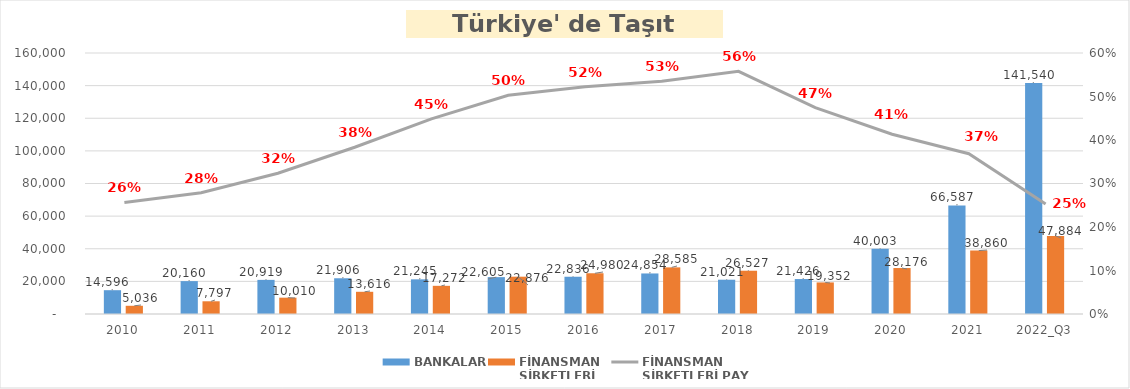
| Category | BANKALAR | FİNANSMAN 
ŞİRKETLERİ |
|---|---|---|
| 2010 | 14595.746 | 5035.89 |
| 2011 | 20160.143 | 7796.854 |
| 2012 | 20919.143 | 10009.755 |
| 2013 | 21905.99 | 13616.036 |
| 2014 | 21244.953 | 17271.844 |
| 2015 | 22605.033 | 22875.563 |
| 2016 | 22835.961 | 24980.231 |
| 2017 | 24853.571 | 28584.938 |
| 2018 | 21021.01 | 26527.133 |
| 2019 | 21426.278 | 19352.327 |
| 2020 | 40002.964 | 28176.3 |
| 2021 | 66586.576 | 38860.099 |
| 2022_Q3 | 141540.287 | 47883.844 |